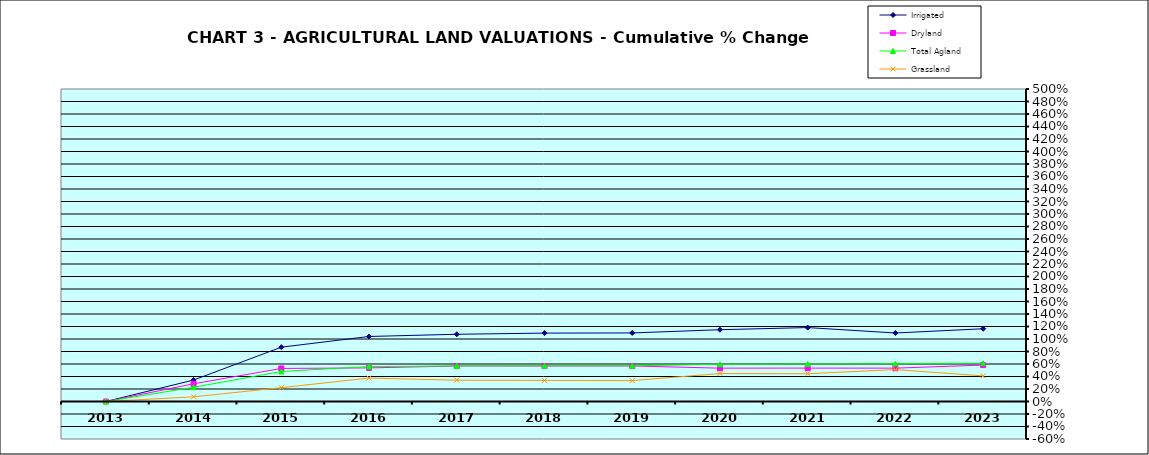
| Category | Irrigated | Dryland | Total Agland | Grassland |
|---|---|---|---|---|
| 2013.0 | 0 | 0 | 0 | 0 |
| 2014.0 | 0.343 | 0.283 | 0.228 | 0.075 |
| 2015.0 | 0.869 | 0.529 | 0.48 | 0.221 |
| 2016.0 | 1.04 | 0.538 | 0.559 | 0.375 |
| 2017.0 | 1.076 | 0.568 | 0.57 | 0.34 |
| 2018.0 | 1.094 | 0.567 | 0.571 | 0.337 |
| 2019.0 | 1.097 | 0.569 | 0.572 | 0.334 |
| 2020.0 | 1.149 | 0.534 | 0.595 | 0.447 |
| 2021.0 | 1.183 | 0.534 | 0.6 | 0.444 |
| 2022.0 | 1.096 | 0.534 | 0.607 | 0.51 |
| 2023.0 | 1.164 | 0.583 | 0.612 | 0.41 |